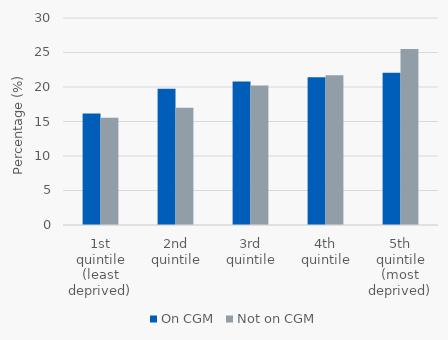
| Category | On CGM | Not on CGM |
|---|---|---|
| 1st quintile (least deprived) | 16.176 | 15.543 |
| 2nd quintile | 19.748 | 17.009 |
| 3rd quintile | 20.798 | 20.235 |
| 4th quintile | 21.429 | 21.701 |
| 5th quintile (most deprived) | 22.059 | 25.513 |